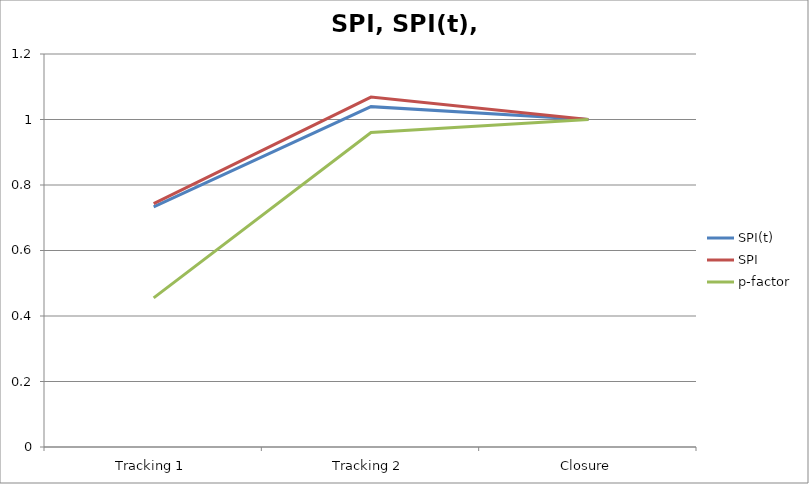
| Category | SPI(t) | SPI | p-factor |
|---|---|---|---|
| Tracking 1 | 0.733 | 0.743 | 0.455 |
| Tracking 2 | 1.039 | 1.068 | 0.96 |
| Closure | 1 | 1 | 1 |